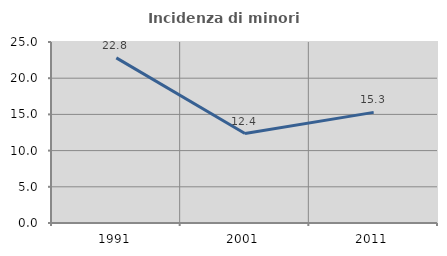
| Category | Incidenza di minori stranieri |
|---|---|
| 1991.0 | 22.807 |
| 2001.0 | 12.356 |
| 2011.0 | 15.28 |